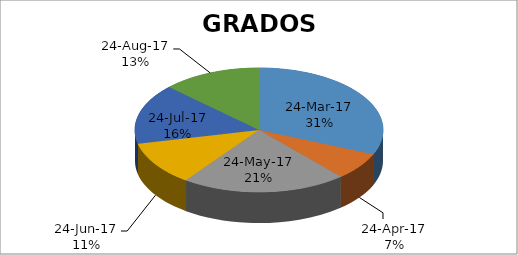
| Category | Series 0 |
|---|---|
| 42818.0 | 22 |
| 42874.0 | 5 |
| 42942.0 | 15 |
| 42993.0 | 8 |
| 43049.0 | 11 |
| 43083.0 | 9 |